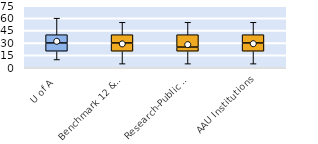
| Category | 25th | 50th | 75th |
|---|---|---|---|
| U of A | 20 | 10 | 10 |
| Benchmark 12 & SEC | 20 | 10 | 10 |
| Research-Public Univ | 20 | 5 | 15 |
| AAU Institutions | 20 | 10 | 10 |